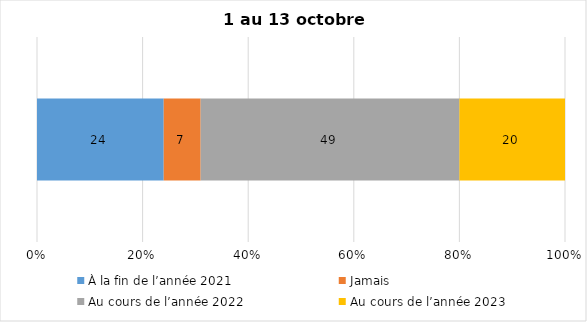
| Category | À la fin de l’année 2021 | Jamais | Au cours de l’année 2022 | Au cours de l’année 2023 |
|---|---|---|---|---|
| 0 | 24 | 7 | 49 | 20 |